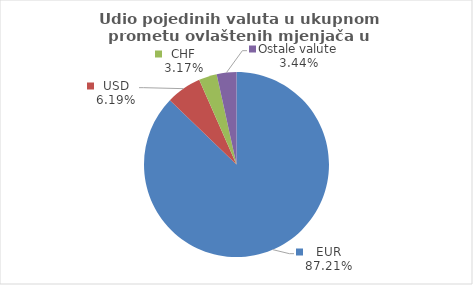
| Category | Series 0 |
|---|---|
| EUR | 87.206 |
| USD | 6.185 |
| CHF | 3.165 |
| Ostale valute | 3.444 |